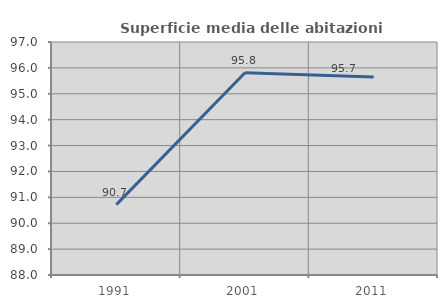
| Category | Superficie media delle abitazioni occupate |
|---|---|
| 1991.0 | 90.717 |
| 2001.0 | 95.812 |
| 2011.0 | 95.652 |